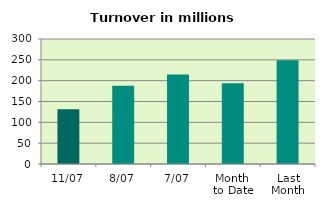
| Category | Series 0 |
|---|---|
| 11/07 | 131.43 |
| 8/07 | 188.05 |
| 7/07 | 214.748 |
| Month 
to Date | 193.544 |
| Last
Month | 248.976 |